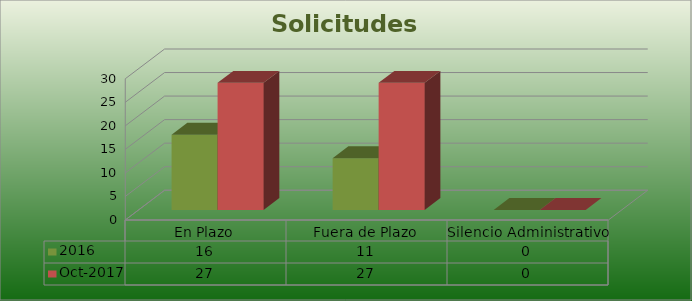
| Category | 2016 | oct-2017 |
|---|---|---|
| En Plazo | 16 | 27 |
| Fuera de Plazo | 11 | 27 |
| Silencio Administrativo | 0 | 0 |